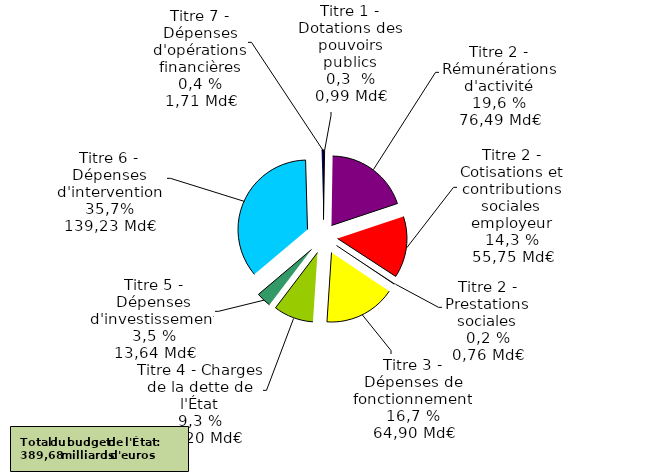
| Category | Part dans le budget de l'État en 2020 (en %) |
|---|---|
| Titre 1 - Dotations des pouvoirs publics | 0.003 |
| Titre 2 - Rémunérations d'activité | 0.196 |
| Titre 2 - Cotisations et contributions sociales employeur | 0.143 |
| Titre 2 - Prestations sociales | 0.002 |
| Titre 3 - Dépenses de fonctionnement | 0.167 |
| Titre 4 - Charges de la dette de l'État | 0.093 |
| Titre 5 - Dépenses d'investissement | 0.035 |
| Titre 6 - Dépenses d'intervention | 0.357 |
| Titre 7 - Dépenses d'opérations financières | 0.004 |